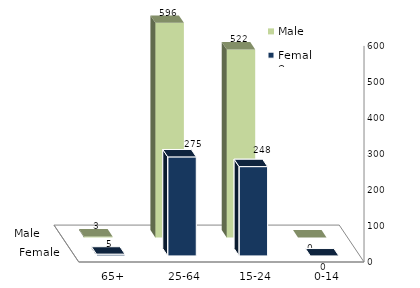
| Category | Male | Female |
|---|---|---|
| 0-14 | 0 | 0 |
| 15-24 | 522 | 248 |
| 25-64 | 596 | 275 |
| 65+ | 3 | 5 |